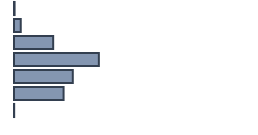
| Category | Percentatge |
|---|---|
| 0 | 0.247 |
| 1 | 2.846 |
| 2 | 16.321 |
| 3 | 35.359 |
| 4 | 24.5 |
| 5 | 20.656 |
| 6 | 0.071 |